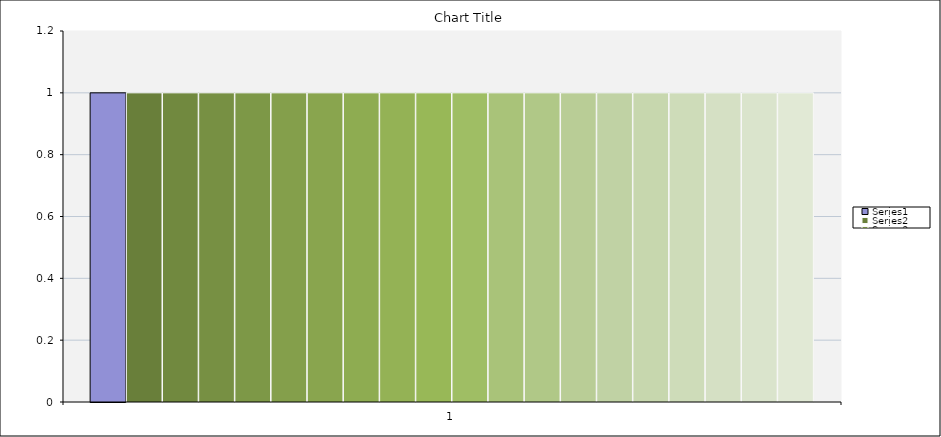
| Category | Series 0 | Series 1 | Series 2 | Series 3 | Series 4 | Series 5 | Series 6 | Series 7 | Series 8 | Series 9 | Series 10 | Series 11 | Series 12 | Series 13 | Series 14 | Series 15 | Series 16 | Series 17 | Series 18 | Series 19 |
|---|---|---|---|---|---|---|---|---|---|---|---|---|---|---|---|---|---|---|---|---|
| 0 | 1 | 1 | 1 | 1 | 1 | 1 | 1 | 1 | 1 | 1 | 1 | 1 | 1 | 1 | 1 | 1 | 1 | 1 | 1 | 1 |